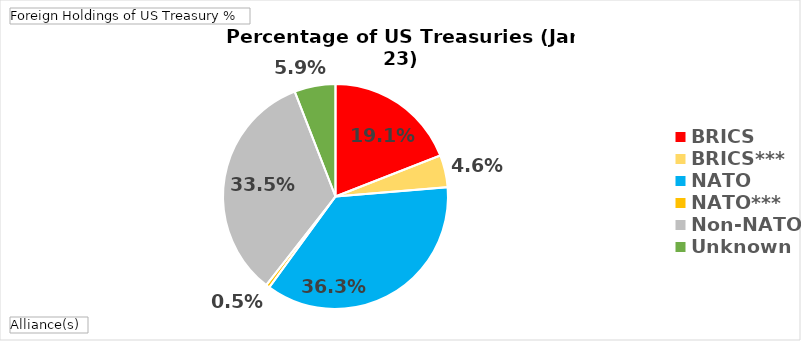
| Category | Total |
|---|---|
| BRICS | 0.191 |
| BRICS*** | 0.046 |
| NATO | 0.363 |
| NATO*** | 0.005 |
| Non-NATO | 0.335 |
| Unknown | 0.059 |